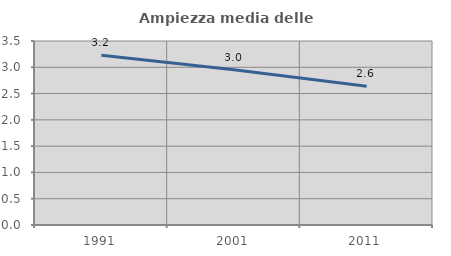
| Category | Ampiezza media delle famiglie |
|---|---|
| 1991.0 | 3.23 |
| 2001.0 | 2.955 |
| 2011.0 | 2.639 |